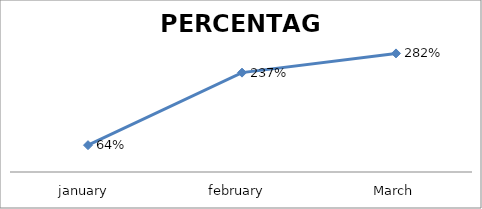
| Category | PERCENTAGE |
|---|---|
| january  | 0.639 |
| february  | 2.366 |
| March | 2.824 |